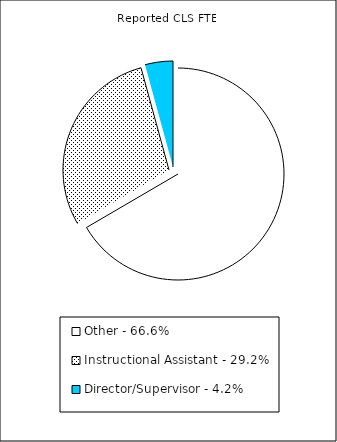
| Category | Reported FTE |
|---|---|
| Other - 66.6% | 30216.75 |
| Instructional Assistant - 29.2% | 13237.77 |
| Director/Supervisor - 4.2% | 1930.81 |